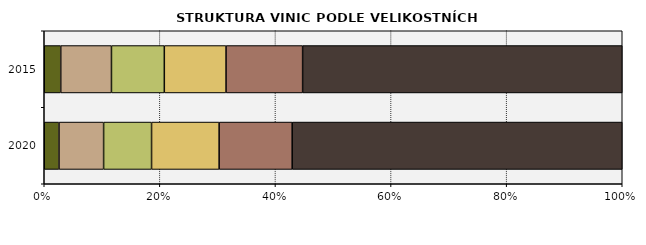
| Category | < 0,10 | 0,10–0,49 | 0,50–2,99 | 3,00–9,99 | 10,00–29,99 | ≥ 30,0 |
|---|---|---|---|---|---|---|
| 2020.0 | 461.553 | 1397.425 | 1501.095 | 2116.247 | 2287.317 | 10335.727 |
| 2015.0 | 504.782 | 1552.186 | 1617.335 | 1889.059 | 2343.44 | 9781.788 |